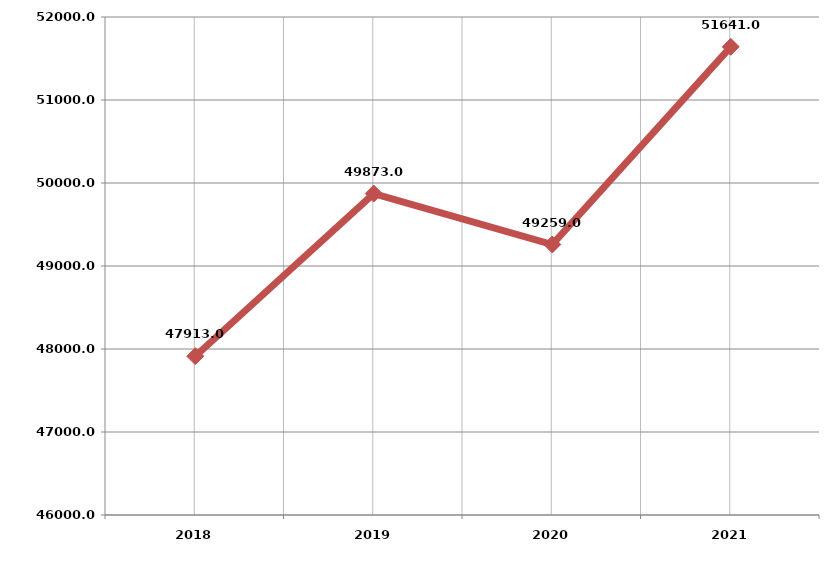
| Category | الطاقة المولــــدة
 [جبجا واط . ساعة) |
|---|---|
| 2018.0 | 47913 |
| 2019.0 | 49873 |
| 2020.0 | 49259 |
| 2021.0 | 51641 |